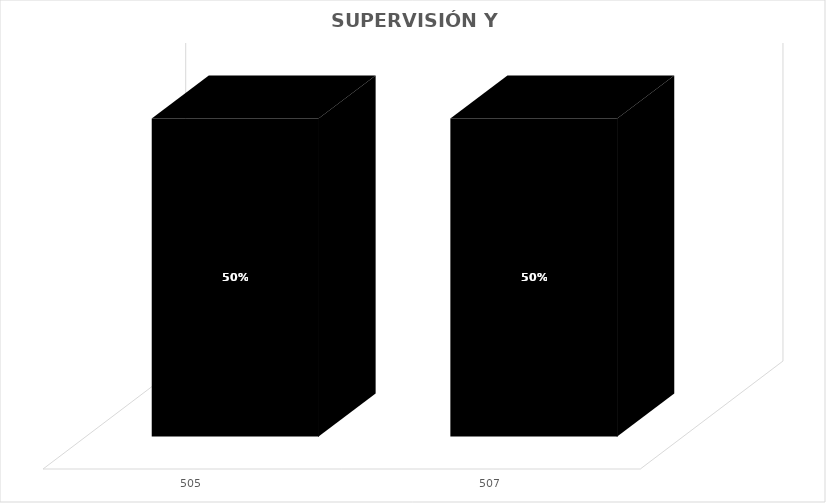
| Category | % Avance |
|---|---|
| 505.0 | 0.5 |
| 507.0 | 0.5 |